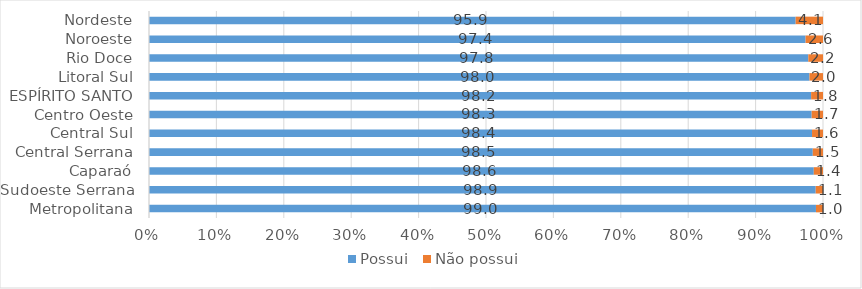
| Category | Possui | Não possui |
|---|---|---|
| Metropolitana | 98.956 | 1.044 |
| Sudoeste Serrana | 98.919 | 1.081 |
| Caparaó | 98.635 | 1.365 |
| Central Serrana | 98.484 | 1.516 |
| Central Sul | 98.373 | 1.627 |
| Centro Oeste | 98.32 | 1.68 |
| ESPÍRITO SANTO | 98.237 | 1.763 |
| Litoral Sul | 97.994 | 2.006 |
| Rio Doce | 97.817 | 2.183 |
| Noroeste | 97.412 | 2.588 |
| Nordeste | 95.943 | 4.057 |